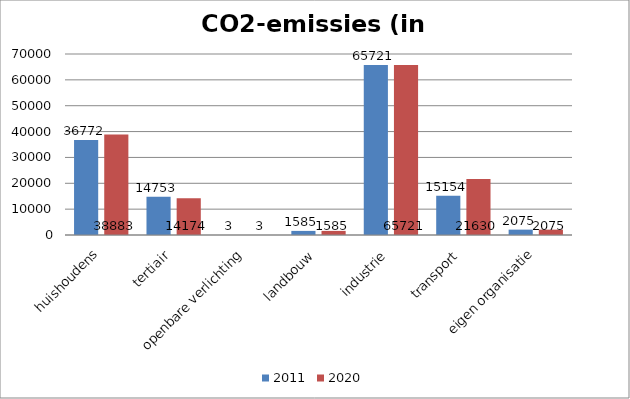
| Category | 2011 | 2020 |
|---|---|---|
| huishoudens | 36772.491 | 38883.493 |
| tertiair | 14753.427 | 14173.743 |
| openbare verlichting | 2.668 | 2.668 |
| landbouw | 1584.664 | 1584.664 |
| industrie | 65721.103 | 65721.103 |
| transport | 15154.35 | 21629.947 |
| eigen organisatie | 2075.148 | 2075.148 |